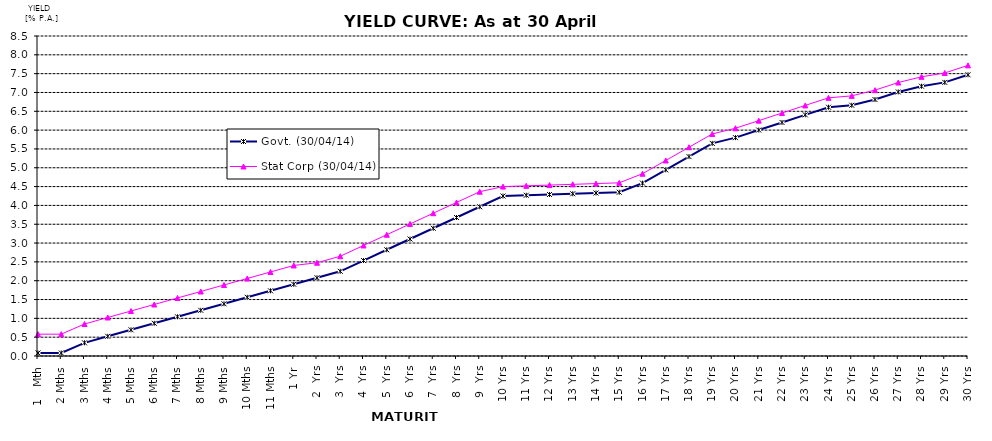
| Category | Govt. (30/04/14) | Stat Corp (30/04/14) | Difference |
|---|---|---|---|
| 1   Mth | 0.08 | 0.58 |  |
| 2 Mths | 0.08 | 0.58 |  |
| 3 Mths | 0.35 | 0.85 |  |
| 4 Mths | 0.523 | 1.023 |  |
| 5 Mths | 0.695 | 1.195 |  |
| 6 Mths | 0.868 | 1.368 |  |
| 7 Mths | 1.041 | 1.541 |  |
| 8 Mths | 1.214 | 1.714 |  |
| 9 Mths | 1.386 | 1.886 |  |
| 10 Mths | 1.559 | 2.059 |  |
| 11 Mths | 1.732 | 2.232 |  |
| 1 Yr | 1.905 | 2.405 |  |
| 2  Yrs | 2.077 | 2.477 |  |
| 3  Yrs | 2.25 | 2.65 |  |
| 4  Yrs | 2.536 | 2.936 |  |
| 5  Yrs | 2.821 | 3.221 |  |
| 6  Yrs | 3.107 | 3.507 |  |
| 7  Yrs | 3.393 | 3.793 |  |
| 8  Yrs | 3.679 | 4.079 |  |
| 9  Yrs | 3.964 | 4.364 |  |
| 10 Yrs | 4.25 | 4.5 |  |
| 11 Yrs | 4.27 | 4.52 |  |
| 12 Yrs | 4.29 | 4.54 |  |
| 13 Yrs | 4.31 | 4.56 |  |
| 14 Yrs | 4.33 | 4.58 |  |
| 15 Yrs | 4.35 | 4.6 |  |
| 16 Yrs | 4.592 | 4.842 |  |
| 17 Yrs | 4.944 | 5.194 |  |
| 18 Yrs | 5.296 | 5.546 |  |
| 19 Yrs | 5.648 | 5.898 |  |
| 20 Yrs | 5.8 | 6.05 |  |
| 21 Yrs | 6.002 | 6.252 |  |
| 22 Yrs | 6.204 | 6.454 |  |
| 23 Yrs | 6.406 | 6.656 |  |
| 24 Yrs | 6.608 | 6.858 |  |
| 25 Yrs | 6.66 | 6.91 |  |
| 26 Yrs | 6.812 | 7.062 |  |
| 27 Yrs | 7.014 | 7.264 |  |
| 28 Yrs | 7.166 | 7.416 |  |
| 29 Yrs | 7.268 | 7.518 |  |
| 30 Yrs | 7.47 | 7.72 |  |